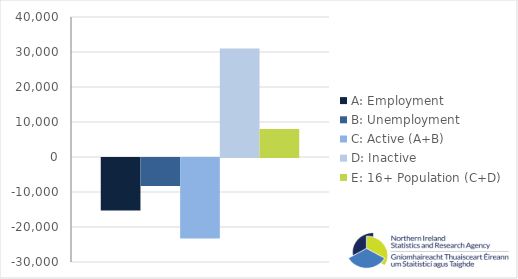
| Category | A: Employment | B: Unemployment | C: Active (A+B) | D: Inactive | E: 16+ Population (C+D) |
|---|---|---|---|---|---|
| 0 | -15000 | -8000 | -23000 | 31000 | 8000 |